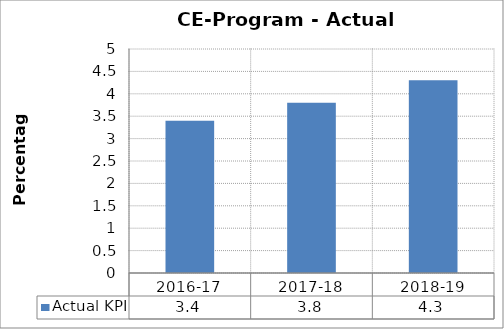
| Category | Actual KPI |
|---|---|
| 2016-17 | 3.4 |
| 2017-18 | 3.8 |
| 2018-19 | 4.3 |